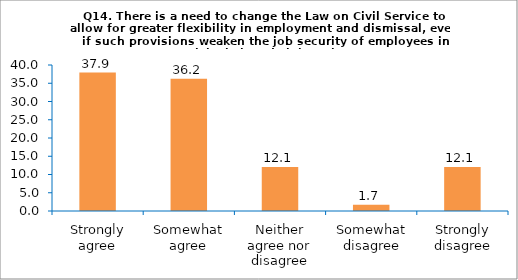
| Category | Series 0 |
|---|---|
| Strongly agree | 37.931 |
| Somewhat agree | 36.207 |
| Neither agree nor disagree | 12.069 |
| Somewhat disagree | 1.724 |
| Strongly disagree | 12.069 |